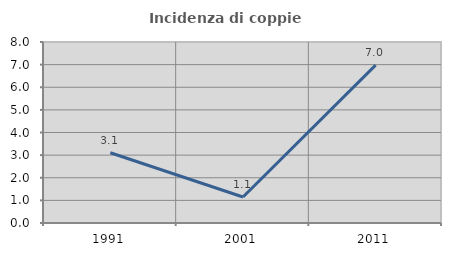
| Category | Incidenza di coppie miste |
|---|---|
| 1991.0 | 3.106 |
| 2001.0 | 1.149 |
| 2011.0 | 6.977 |